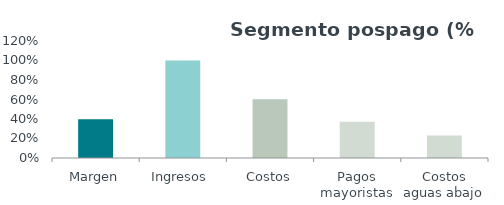
| Category | Series 0 |
|---|---|
| Margen | 0.397 |
| Ingresos  | 1 |
| Costos | 0.603 |
| Pagos mayoristas | 0.371 |
| Costos aguas abajo | 0.232 |